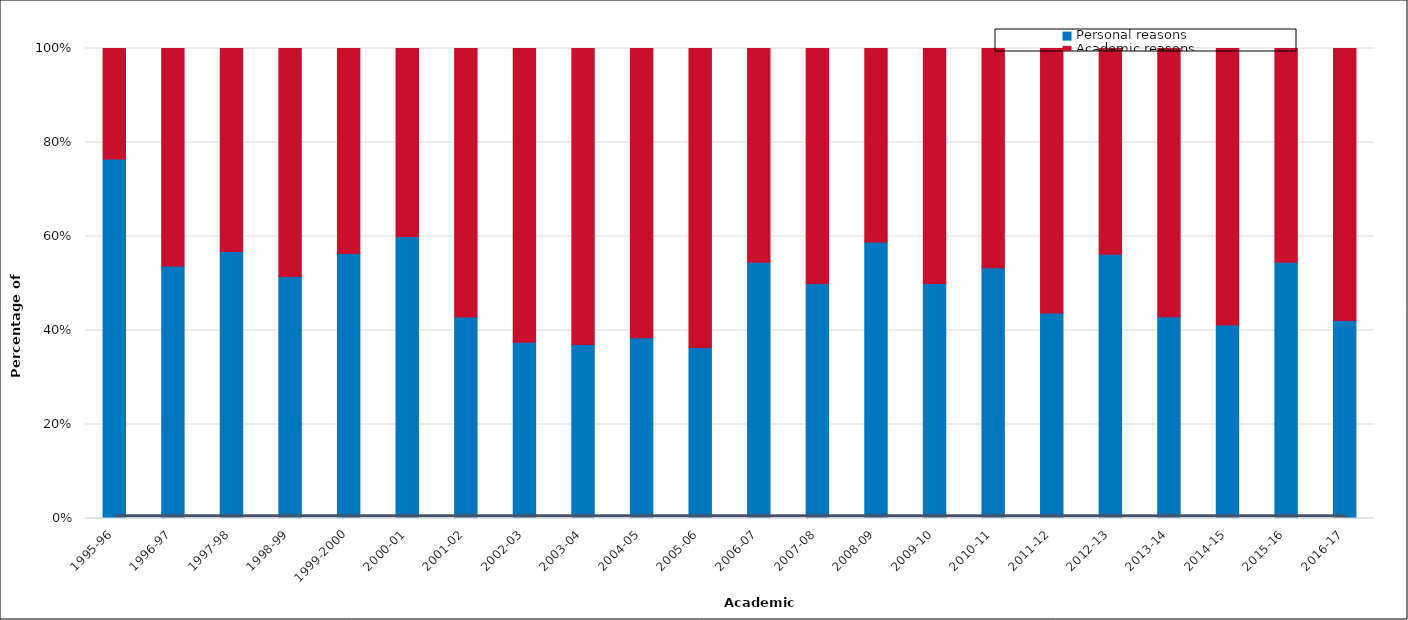
| Category | Personal reasons | Academic reasons |
|---|---|---|
| 1995-96 | 0.765 | 0.235 |
| 1996-97 | 0.537 | 0.463 |
| 1997-98 | 0.568 | 0.432 |
| 1998-99 | 0.515 | 0.485 |
| 1999-2000 | 0.564 | 0.436 |
| 2000-01 | 0.6 | 0.4 |
| 2001-02 | 0.429 | 0.571 |
| 2002-03 | 0.375 | 0.625 |
| 2003-04 | 0.37 | 0.63 |
| 2004-05 | 0.385 | 0.615 |
| 2005-06 | 0.364 | 0.636 |
| 2006-07 | 0.545 | 0.455 |
| 2007-08 | 0.5 | 0.5 |
| 2008-09 | 0.588 | 0.412 |
| 2009-10 | 0.5 | 0.5 |
| 2010-11 | 0.533 | 0.467 |
| 2011-12 | 0.437 | 0.563 |
| 2012-13 | 0.562 | 0.437 |
| 2013-14 | 0.429 | 0.571 |
| 2014-15 | 0.412 | 0.588 |
| 2015-16 | 0.545 | 0.455 |
| 2016-17 | 0.421 | 0.579 |